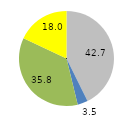
| Category | Series 0 |
|---|---|
| 0 | 42.7 |
| 1 | 3.5 |
| 2 | 35.8 |
| 3 | 18 |